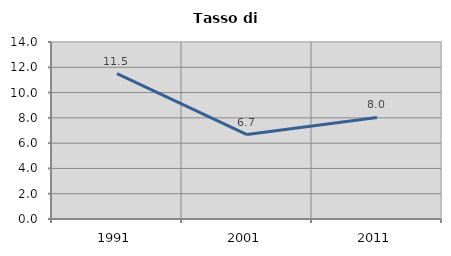
| Category | Tasso di disoccupazione   |
|---|---|
| 1991.0 | 11.494 |
| 2001.0 | 6.675 |
| 2011.0 | 8.033 |